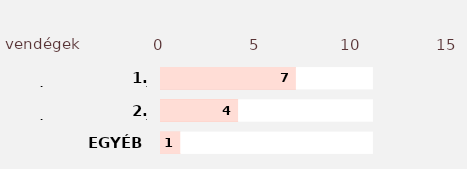
| Category | Series 2 | Series 3 | Series 1 | Series 0 |
|---|---|---|---|---|
| EGYÉB | 11 | 1 | 11 | 1 |
| 2. HÁZASULANDÓ | 11 | 4 | 11 | 4 |
| 1. HÁZASULANDÓ | 11 | 7 | 11 | 7 |